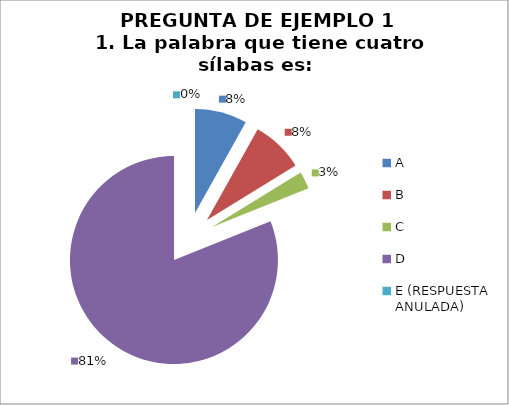
| Category | CANTIDAD DE RESPUESTAS PREGUNTA (1) | PORCENTAJE |
|---|---|---|
| A | 3 | 0.081 |
| B | 3 | 0.081 |
| C | 1 | 0.027 |
| D | 30 | 0.811 |
| E (RESPUESTA ANULADA) | 0 | 0 |